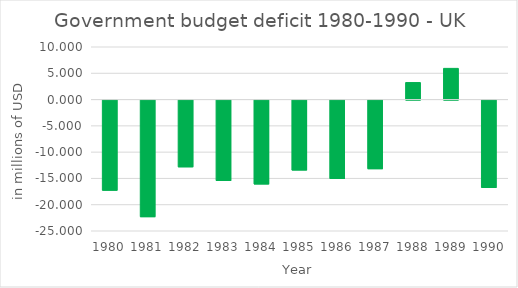
| Category | Series 0 |
|---|---|
| 1980.0 | -17.15 |
| 1981.0 | -22.173 |
| 1982.0 | -12.704 |
| 1983.0 | -15.3 |
| 1984.0 | -15.958 |
| 1985.0 | -13.31 |
| 1986.0 | -14.914 |
| 1987.0 | -13.05 |
| 1988.0 | 3.236 |
| 1989.0 | 5.933 |
| 1990.0 | -16.613 |